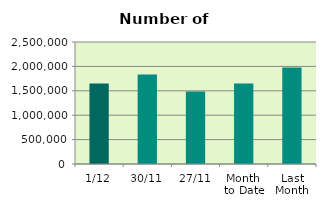
| Category | Series 0 |
|---|---|
| 1/12 | 1647540 |
| 30/11 | 1834176 |
| 27/11 | 1486386 |
| Month 
to Date | 1647540 |
| Last
Month | 1976001.238 |